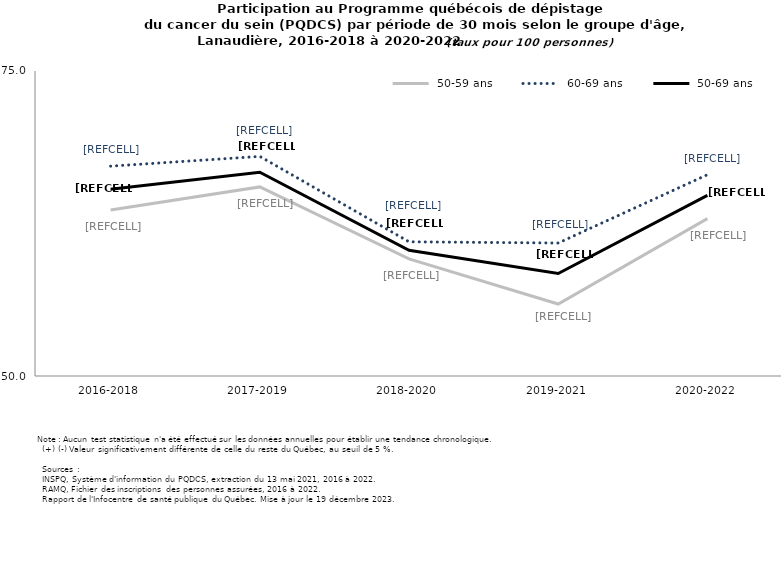
| Category |  50-59 ans |  60-69 ans |  50-69 ans |
|---|---|---|---|
| 2016-2018 | 63.6 | 67.2 | 65.3 |
| 2017-2019 | 65.5 | 68 | 66.7 |
| 2018-2020 | 59.6 | 61 | 60.3 |
| 2019-2021 | 55.9 | 60.9 | 58.4 |
| 2020-2022 | 62.9 | 66.5 | 64.8 |